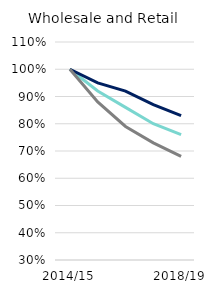
| Category | UK and RoI | EEA | Non-EEA |
|---|---|---|---|
| 2014/15 | 1 | 1 | 1 |
| 2015/16 | 0.92 | 0.95 | 0.88 |
| 2016/16 | 0.86 | 0.92 | 0.79 |
| 2017/18 | 0.8 | 0.87 | 0.73 |
| 2018/19 | 0.76 | 0.83 | 0.68 |